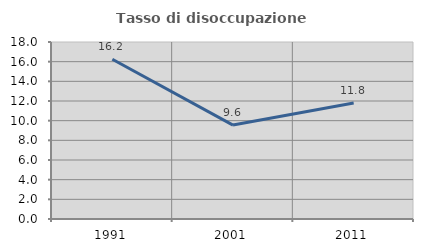
| Category | Tasso di disoccupazione giovanile  |
|---|---|
| 1991.0 | 16.246 |
| 2001.0 | 9.551 |
| 2011.0 | 11.806 |